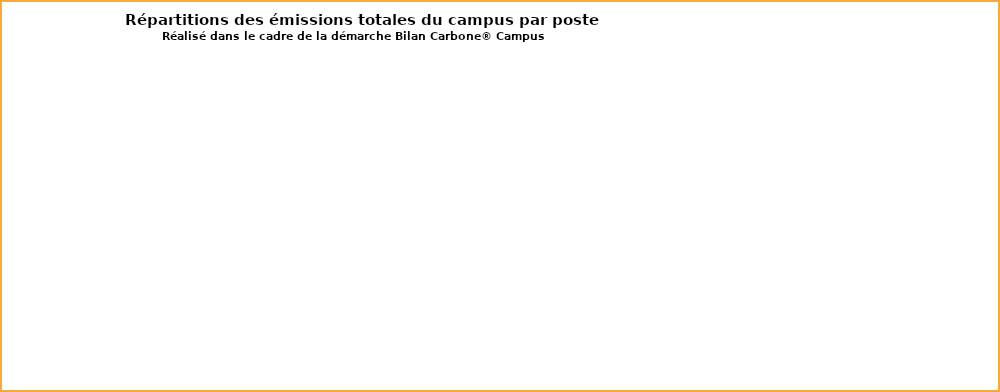
| Category | Series 0 |
|---|---|
| Sources fixes | 0 |
| Fret | 0 |
| Déplacements de personnes | 0 |
| Consommables et matériaux | 0 |
| Restaurant universitaire | 0 |
| Déchêts directs | 0 |
| Immobilisations | 0 |